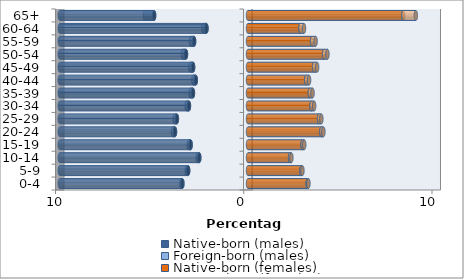
| Category | Native-born (males) | Foreign-born (males) | Native-born (females) | Foreign-born (females) |
|---|---|---|---|---|
| 0-4 | -3.486 | -0.054 | 3.173 | 0.038 |
| 5-9 | -3.18 | -0.077 | 2.836 | 0.056 |
| 10-14 | -2.589 | -0.091 | 2.235 | 0.071 |
| 15-19 | -3.048 | -0.101 | 2.9 | 0.087 |
| 20-24 | -3.878 | -0.113 | 3.898 | 0.108 |
| 25-29 | -3.777 | -0.121 | 3.772 | 0.126 |
| 30-34 | -3.137 | -0.125 | 3.377 | 0.136 |
| 35-39 | -2.925 | -0.126 | 3.287 | 0.141 |
| 40-44 | -2.772 | -0.133 | 3.097 | 0.148 |
| 45-49 | -2.917 | -0.149 | 3.51 | 0.162 |
| 50-54 | -3.295 | -0.165 | 4.04 | 0.18 |
| 55-59 | -2.862 | -0.166 | 3.402 | 0.19 |
| 60-64 | -2.206 | -0.17 | 2.786 | 0.19 |
| 65+ | -4.986 | -0.488 | 8.253 | 0.663 |